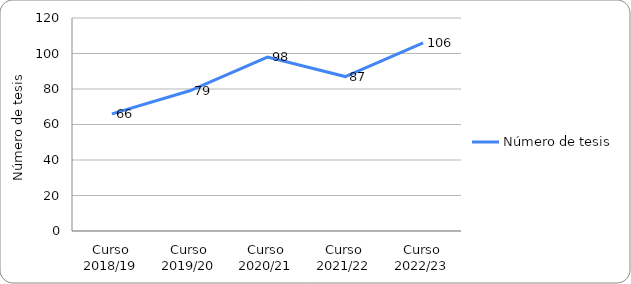
| Category | Número de tesis |
|---|---|
| Curso 2018/19 | 66 |
| Curso 2019/20 | 79 |
| Curso 2020/21 | 98 |
| Curso 2021/22 | 87 |
| Curso 2022/23 | 106 |